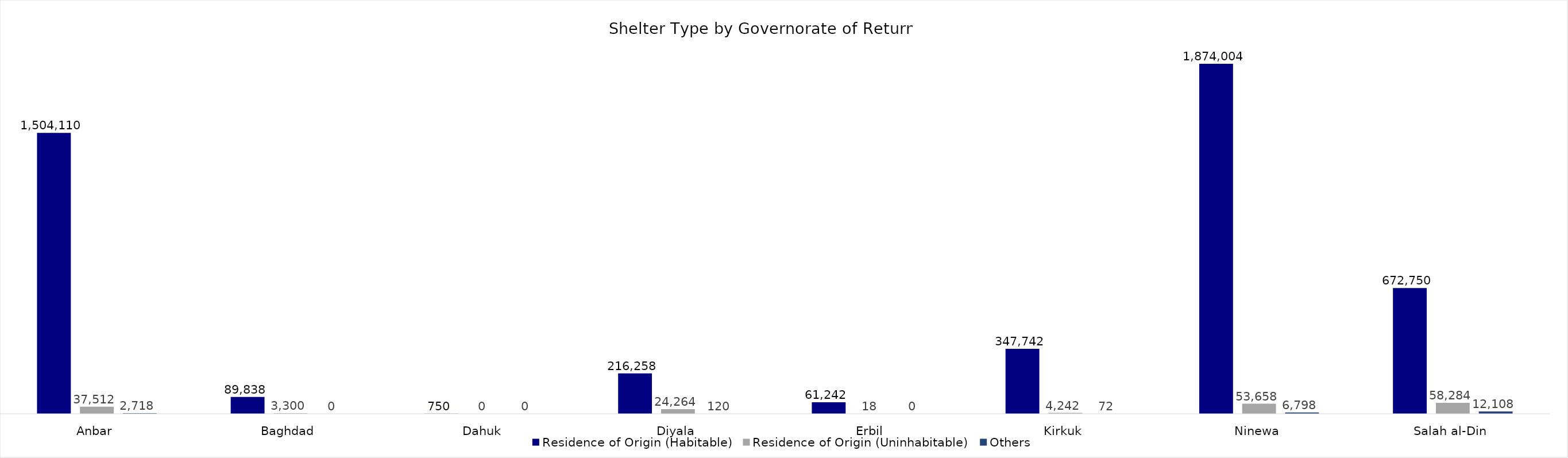
| Category | Residence of Origin (Habitable) | Residence of Origin (Uninhabitable) | Others |
|---|---|---|---|
| Anbar | 1504110 | 37512 | 2718 |
| Baghdad | 89838 | 3300 | 0 |
| Dahuk | 750 | 0 | 0 |
| Diyala | 216258 | 24264 | 120 |
| Erbil | 61242 | 18 | 0 |
| Kirkuk | 347742 | 4242 | 72 |
| Ninewa | 1874004 | 53658 | 6798 |
| Salah al-Din | 672750 | 58284 | 12108 |